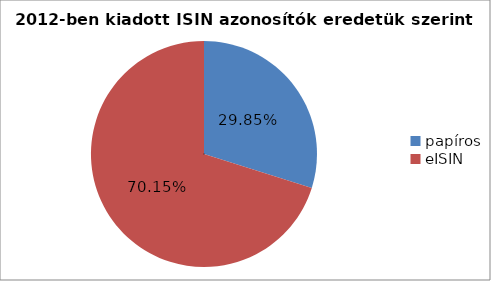
| Category | Series 0 |
|---|---|
| papíros | 0.299 |
| eISIN | 0.701 |